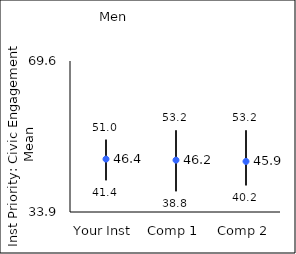
| Category | 25th percentile | 75th percentile | Mean |
|---|---|---|---|
| Your Inst | 41.4 | 51 | 46.41 |
| Comp 1 | 38.8 | 53.2 | 46.16 |
| Comp 2 | 40.2 | 53.2 | 45.86 |